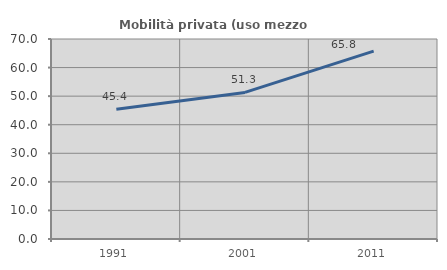
| Category | Mobilità privata (uso mezzo privato) |
|---|---|
| 1991.0 | 45.386 |
| 2001.0 | 51.313 |
| 2011.0 | 65.76 |